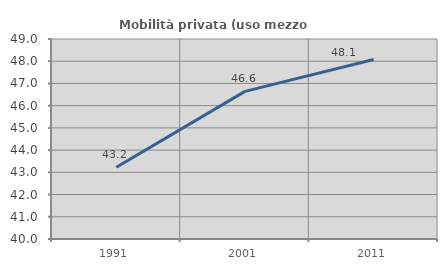
| Category | Mobilità privata (uso mezzo privato) |
|---|---|
| 1991.0 | 43.225 |
| 2001.0 | 46.642 |
| 2011.0 | 48.079 |